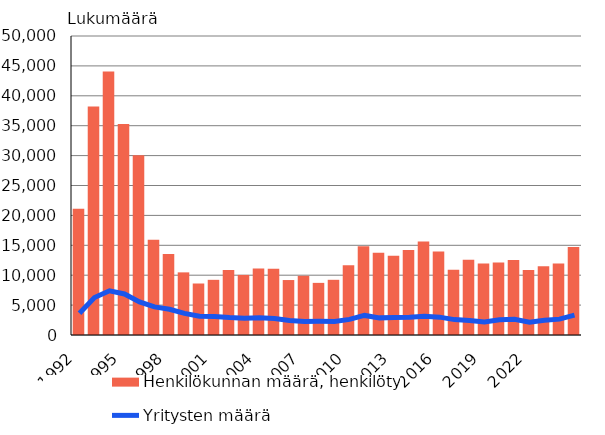
| Category | Henkilökunnan määrä, henkilötyövuotta |
|---|---|
| 1992.0 | 21101 |
| 1993.0 | 38200 |
| 1994.0 | 44050 |
| 1995.0 | 35282 |
| 1996.0 | 30052 |
| 1997.0 | 15922 |
| 1998.0 | 13551 |
| 1999.0 | 10473 |
| 2000.0 | 8612 |
| 2001.0 | 9226 |
| 2002.0 | 10849 |
| 2003.0 | 10047 |
| 2004.0 | 11126 |
| 2005.0 | 11061 |
| 2006.0 | 9191 |
| 2007.0 | 9898 |
| 2008.0 | 8717 |
| 2009.0 | 9230 |
| 2010.0 | 11660 |
| 2011.0 | 14860 |
| 2012.0 | 13759 |
| 2013.0 | 13270 |
| 2014.0 | 14206 |
| 2015.0 | 15637 |
| 2016.0 | 13951 |
| 2017.0 | 10902 |
| 2018.0 | 12580 |
| 2019.0 | 11943 |
| 2020.0 | 12127 |
| 2021.0 | 12548 |
| 2022.0 | 10876 |
| 2023.0 | 11490 |